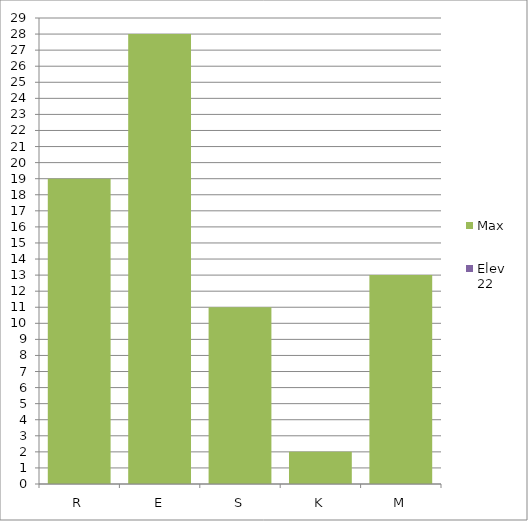
| Category | Max | Elev 22 |
|---|---|---|
| R | 19 | 0 |
| E | 28 | 0 |
| S | 11 | 0 |
| K | 2 | 0 |
| M | 13 | 0 |